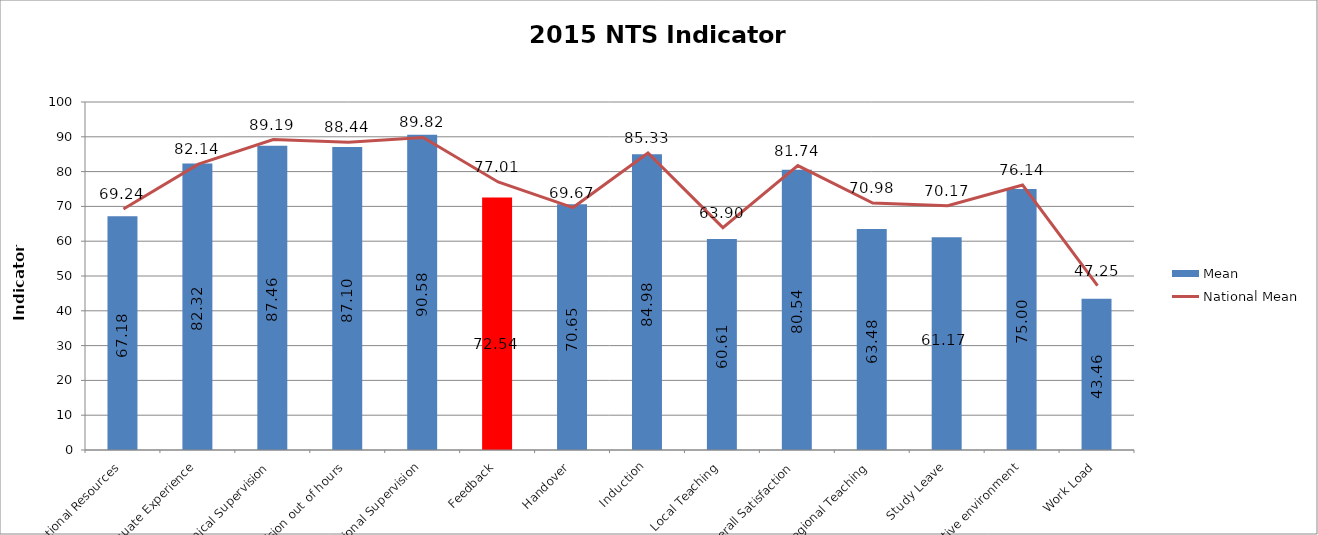
| Category | Mean |
|---|---|
| Access to Educational Resources | 67.18 |
| Adequate Experience | 82.32 |
| Clinical Supervision | 87.46 |
| Clinical Supervision out of hours | 87.1 |
| Educational Supervision | 90.58 |
| Feedback | 72.54 |
| Handover | 70.65 |
| Induction | 84.98 |
| Local Teaching | 60.61 |
| Overall Satisfaction | 80.54 |
| Regional Teaching | 63.48 |
| Study Leave | 61.17 |
| Supportive environment | 75 |
| Work Load | 43.46 |